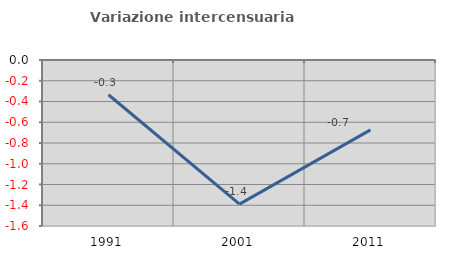
| Category | Variazione intercensuaria annua |
|---|---|
| 1991.0 | -0.335 |
| 2001.0 | -1.389 |
| 2011.0 | -0.674 |